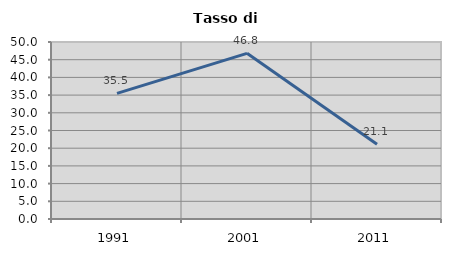
| Category | Tasso di disoccupazione   |
|---|---|
| 1991.0 | 35.495 |
| 2001.0 | 46.802 |
| 2011.0 | 21.122 |